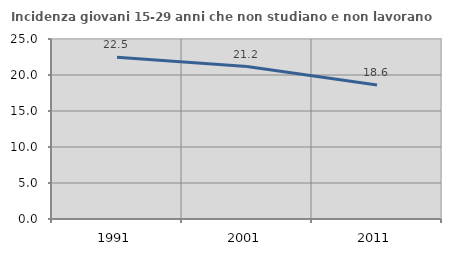
| Category | Incidenza giovani 15-29 anni che non studiano e non lavorano  |
|---|---|
| 1991.0 | 22.465 |
| 2001.0 | 21.171 |
| 2011.0 | 18.605 |